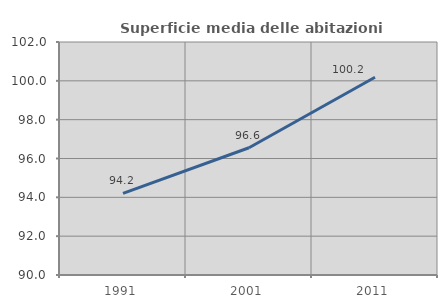
| Category | Superficie media delle abitazioni occupate |
|---|---|
| 1991.0 | 94.205 |
| 2001.0 | 96.554 |
| 2011.0 | 100.185 |